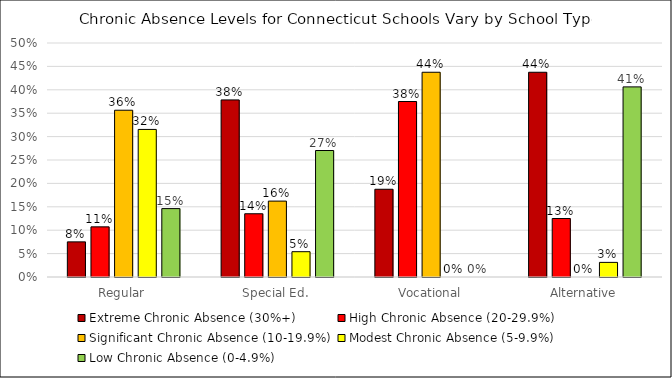
| Category | Extreme Chronic Absence (30%+) | High Chronic Absence (20-29.9%) | Significant Chronic Absence (10-19.9%) | Modest Chronic Absence (5-9.9%) | Low Chronic Absence (0-4.9%) |
|---|---|---|---|---|---|
| Regular | 0.075 | 0.107 | 0.356 | 0.315 | 0.146 |
| Special Ed. | 0.378 | 0.135 | 0.162 | 0.054 | 0.27 |
| Vocational | 0.188 | 0.375 | 0.438 | 0 | 0 |
| Alternative | 0.438 | 0.125 | 0 | 0.031 | 0.406 |